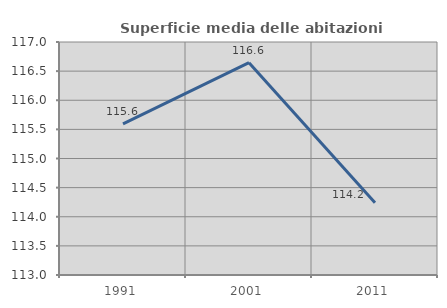
| Category | Superficie media delle abitazioni occupate |
|---|---|
| 1991.0 | 115.593 |
| 2001.0 | 116.645 |
| 2011.0 | 114.24 |